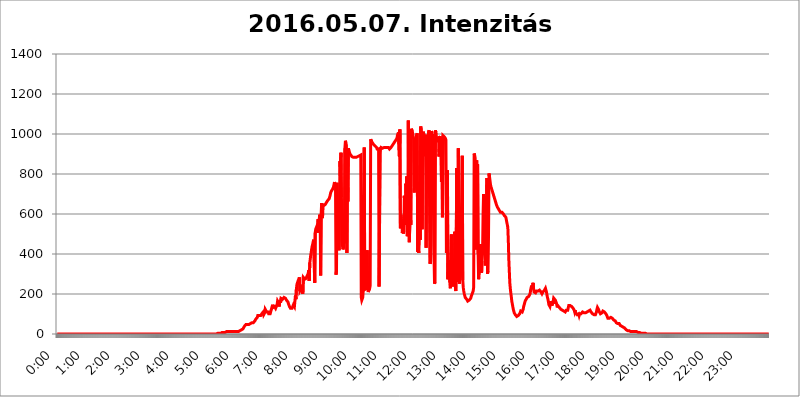
| Category | 2016.05.07. Intenzitás [W/m^2] |
|---|---|
| 0.0 | 0 |
| 0.0006944444444444445 | 0 |
| 0.001388888888888889 | 0 |
| 0.0020833333333333333 | 0 |
| 0.002777777777777778 | 0 |
| 0.003472222222222222 | 0 |
| 0.004166666666666667 | 0 |
| 0.004861111111111111 | 0 |
| 0.005555555555555556 | 0 |
| 0.0062499999999999995 | 0 |
| 0.006944444444444444 | 0 |
| 0.007638888888888889 | 0 |
| 0.008333333333333333 | 0 |
| 0.009027777777777779 | 0 |
| 0.009722222222222222 | 0 |
| 0.010416666666666666 | 0 |
| 0.011111111111111112 | 0 |
| 0.011805555555555555 | 0 |
| 0.012499999999999999 | 0 |
| 0.013194444444444444 | 0 |
| 0.013888888888888888 | 0 |
| 0.014583333333333332 | 0 |
| 0.015277777777777777 | 0 |
| 0.015972222222222224 | 0 |
| 0.016666666666666666 | 0 |
| 0.017361111111111112 | 0 |
| 0.018055555555555557 | 0 |
| 0.01875 | 0 |
| 0.019444444444444445 | 0 |
| 0.02013888888888889 | 0 |
| 0.020833333333333332 | 0 |
| 0.02152777777777778 | 0 |
| 0.022222222222222223 | 0 |
| 0.02291666666666667 | 0 |
| 0.02361111111111111 | 0 |
| 0.024305555555555556 | 0 |
| 0.024999999999999998 | 0 |
| 0.025694444444444447 | 0 |
| 0.02638888888888889 | 0 |
| 0.027083333333333334 | 0 |
| 0.027777777777777776 | 0 |
| 0.02847222222222222 | 0 |
| 0.029166666666666664 | 0 |
| 0.029861111111111113 | 0 |
| 0.030555555555555555 | 0 |
| 0.03125 | 0 |
| 0.03194444444444445 | 0 |
| 0.03263888888888889 | 0 |
| 0.03333333333333333 | 0 |
| 0.034027777777777775 | 0 |
| 0.034722222222222224 | 0 |
| 0.035416666666666666 | 0 |
| 0.036111111111111115 | 0 |
| 0.03680555555555556 | 0 |
| 0.0375 | 0 |
| 0.03819444444444444 | 0 |
| 0.03888888888888889 | 0 |
| 0.03958333333333333 | 0 |
| 0.04027777777777778 | 0 |
| 0.04097222222222222 | 0 |
| 0.041666666666666664 | 0 |
| 0.042361111111111106 | 0 |
| 0.04305555555555556 | 0 |
| 0.043750000000000004 | 0 |
| 0.044444444444444446 | 0 |
| 0.04513888888888889 | 0 |
| 0.04583333333333334 | 0 |
| 0.04652777777777778 | 0 |
| 0.04722222222222222 | 0 |
| 0.04791666666666666 | 0 |
| 0.04861111111111111 | 0 |
| 0.049305555555555554 | 0 |
| 0.049999999999999996 | 0 |
| 0.05069444444444445 | 0 |
| 0.051388888888888894 | 0 |
| 0.052083333333333336 | 0 |
| 0.05277777777777778 | 0 |
| 0.05347222222222222 | 0 |
| 0.05416666666666667 | 0 |
| 0.05486111111111111 | 0 |
| 0.05555555555555555 | 0 |
| 0.05625 | 0 |
| 0.05694444444444444 | 0 |
| 0.057638888888888885 | 0 |
| 0.05833333333333333 | 0 |
| 0.05902777777777778 | 0 |
| 0.059722222222222225 | 0 |
| 0.06041666666666667 | 0 |
| 0.061111111111111116 | 0 |
| 0.06180555555555556 | 0 |
| 0.0625 | 0 |
| 0.06319444444444444 | 0 |
| 0.06388888888888888 | 0 |
| 0.06458333333333334 | 0 |
| 0.06527777777777778 | 0 |
| 0.06597222222222222 | 0 |
| 0.06666666666666667 | 0 |
| 0.06736111111111111 | 0 |
| 0.06805555555555555 | 0 |
| 0.06874999999999999 | 0 |
| 0.06944444444444443 | 0 |
| 0.07013888888888889 | 0 |
| 0.07083333333333333 | 0 |
| 0.07152777777777779 | 0 |
| 0.07222222222222223 | 0 |
| 0.07291666666666667 | 0 |
| 0.07361111111111111 | 0 |
| 0.07430555555555556 | 0 |
| 0.075 | 0 |
| 0.07569444444444444 | 0 |
| 0.0763888888888889 | 0 |
| 0.07708333333333334 | 0 |
| 0.07777777777777778 | 0 |
| 0.07847222222222222 | 0 |
| 0.07916666666666666 | 0 |
| 0.0798611111111111 | 0 |
| 0.08055555555555556 | 0 |
| 0.08125 | 0 |
| 0.08194444444444444 | 0 |
| 0.08263888888888889 | 0 |
| 0.08333333333333333 | 0 |
| 0.08402777777777777 | 0 |
| 0.08472222222222221 | 0 |
| 0.08541666666666665 | 0 |
| 0.08611111111111112 | 0 |
| 0.08680555555555557 | 0 |
| 0.08750000000000001 | 0 |
| 0.08819444444444445 | 0 |
| 0.08888888888888889 | 0 |
| 0.08958333333333333 | 0 |
| 0.09027777777777778 | 0 |
| 0.09097222222222222 | 0 |
| 0.09166666666666667 | 0 |
| 0.09236111111111112 | 0 |
| 0.09305555555555556 | 0 |
| 0.09375 | 0 |
| 0.09444444444444444 | 0 |
| 0.09513888888888888 | 0 |
| 0.09583333333333333 | 0 |
| 0.09652777777777777 | 0 |
| 0.09722222222222222 | 0 |
| 0.09791666666666667 | 0 |
| 0.09861111111111111 | 0 |
| 0.09930555555555555 | 0 |
| 0.09999999999999999 | 0 |
| 0.10069444444444443 | 0 |
| 0.1013888888888889 | 0 |
| 0.10208333333333335 | 0 |
| 0.10277777777777779 | 0 |
| 0.10347222222222223 | 0 |
| 0.10416666666666667 | 0 |
| 0.10486111111111111 | 0 |
| 0.10555555555555556 | 0 |
| 0.10625 | 0 |
| 0.10694444444444444 | 0 |
| 0.1076388888888889 | 0 |
| 0.10833333333333334 | 0 |
| 0.10902777777777778 | 0 |
| 0.10972222222222222 | 0 |
| 0.1111111111111111 | 0 |
| 0.11180555555555556 | 0 |
| 0.11180555555555556 | 0 |
| 0.1125 | 0 |
| 0.11319444444444444 | 0 |
| 0.11388888888888889 | 0 |
| 0.11458333333333333 | 0 |
| 0.11527777777777777 | 0 |
| 0.11597222222222221 | 0 |
| 0.11666666666666665 | 0 |
| 0.1173611111111111 | 0 |
| 0.11805555555555557 | 0 |
| 0.11944444444444445 | 0 |
| 0.12013888888888889 | 0 |
| 0.12083333333333333 | 0 |
| 0.12152777777777778 | 0 |
| 0.12222222222222223 | 0 |
| 0.12291666666666667 | 0 |
| 0.12291666666666667 | 0 |
| 0.12361111111111112 | 0 |
| 0.12430555555555556 | 0 |
| 0.125 | 0 |
| 0.12569444444444444 | 0 |
| 0.12638888888888888 | 0 |
| 0.12708333333333333 | 0 |
| 0.16875 | 0 |
| 0.12847222222222224 | 0 |
| 0.12916666666666668 | 0 |
| 0.12986111111111112 | 0 |
| 0.13055555555555556 | 0 |
| 0.13125 | 0 |
| 0.13194444444444445 | 0 |
| 0.1326388888888889 | 0 |
| 0.13333333333333333 | 0 |
| 0.13402777777777777 | 0 |
| 0.13402777777777777 | 0 |
| 0.13472222222222222 | 0 |
| 0.13541666666666666 | 0 |
| 0.1361111111111111 | 0 |
| 0.13749999999999998 | 0 |
| 0.13819444444444443 | 0 |
| 0.1388888888888889 | 0 |
| 0.13958333333333334 | 0 |
| 0.14027777777777778 | 0 |
| 0.14097222222222222 | 0 |
| 0.14166666666666666 | 0 |
| 0.1423611111111111 | 0 |
| 0.14305555555555557 | 0 |
| 0.14375000000000002 | 0 |
| 0.14444444444444446 | 0 |
| 0.1451388888888889 | 0 |
| 0.1451388888888889 | 0 |
| 0.14652777777777778 | 0 |
| 0.14722222222222223 | 0 |
| 0.14791666666666667 | 0 |
| 0.1486111111111111 | 0 |
| 0.14930555555555555 | 0 |
| 0.15 | 0 |
| 0.15069444444444444 | 0 |
| 0.15138888888888888 | 0 |
| 0.15208333333333332 | 0 |
| 0.15277777777777776 | 0 |
| 0.15347222222222223 | 0 |
| 0.15416666666666667 | 0 |
| 0.15486111111111112 | 0 |
| 0.15555555555555556 | 0 |
| 0.15625 | 0 |
| 0.15694444444444444 | 0 |
| 0.15763888888888888 | 0 |
| 0.15833333333333333 | 0 |
| 0.15902777777777777 | 0 |
| 0.15972222222222224 | 0 |
| 0.16041666666666668 | 0 |
| 0.16111111111111112 | 0 |
| 0.16180555555555556 | 0 |
| 0.1625 | 0 |
| 0.16319444444444445 | 0 |
| 0.1638888888888889 | 0 |
| 0.16458333333333333 | 0 |
| 0.16527777777777777 | 0 |
| 0.16597222222222222 | 0 |
| 0.16666666666666666 | 0 |
| 0.1673611111111111 | 0 |
| 0.16805555555555554 | 0 |
| 0.16874999999999998 | 0 |
| 0.16944444444444443 | 0 |
| 0.17013888888888887 | 0 |
| 0.1708333333333333 | 0 |
| 0.17152777777777775 | 0 |
| 0.17222222222222225 | 0 |
| 0.1729166666666667 | 0 |
| 0.17361111111111113 | 0 |
| 0.17430555555555557 | 0 |
| 0.17500000000000002 | 0 |
| 0.17569444444444446 | 0 |
| 0.1763888888888889 | 0 |
| 0.17708333333333334 | 0 |
| 0.17777777777777778 | 0 |
| 0.17847222222222223 | 0 |
| 0.17916666666666667 | 0 |
| 0.1798611111111111 | 0 |
| 0.18055555555555555 | 0 |
| 0.18125 | 0 |
| 0.18194444444444444 | 0 |
| 0.1826388888888889 | 0 |
| 0.18333333333333335 | 0 |
| 0.1840277777777778 | 0 |
| 0.18472222222222223 | 0 |
| 0.18541666666666667 | 0 |
| 0.18611111111111112 | 0 |
| 0.18680555555555556 | 0 |
| 0.1875 | 0 |
| 0.18819444444444444 | 0 |
| 0.18888888888888888 | 0 |
| 0.18958333333333333 | 0 |
| 0.19027777777777777 | 0 |
| 0.1909722222222222 | 0 |
| 0.19166666666666665 | 0 |
| 0.19236111111111112 | 0 |
| 0.19305555555555554 | 0 |
| 0.19375 | 0 |
| 0.19444444444444445 | 0 |
| 0.1951388888888889 | 0 |
| 0.19583333333333333 | 0 |
| 0.19652777777777777 | 0 |
| 0.19722222222222222 | 0 |
| 0.19791666666666666 | 0 |
| 0.1986111111111111 | 0 |
| 0.19930555555555554 | 0 |
| 0.19999999999999998 | 0 |
| 0.20069444444444443 | 0 |
| 0.20138888888888887 | 0 |
| 0.2020833333333333 | 0 |
| 0.2027777777777778 | 0 |
| 0.2034722222222222 | 0 |
| 0.2041666666666667 | 0 |
| 0.20486111111111113 | 0 |
| 0.20555555555555557 | 0 |
| 0.20625000000000002 | 0 |
| 0.20694444444444446 | 0 |
| 0.2076388888888889 | 0 |
| 0.20833333333333334 | 0 |
| 0.20902777777777778 | 0 |
| 0.20972222222222223 | 0 |
| 0.21041666666666667 | 0 |
| 0.2111111111111111 | 0 |
| 0.21180555555555555 | 0 |
| 0.2125 | 0 |
| 0.21319444444444444 | 0 |
| 0.2138888888888889 | 0 |
| 0.21458333333333335 | 0 |
| 0.2152777777777778 | 0 |
| 0.21597222222222223 | 0 |
| 0.21666666666666667 | 0 |
| 0.21736111111111112 | 0 |
| 0.21805555555555556 | 0 |
| 0.21875 | 0 |
| 0.21944444444444444 | 0 |
| 0.22013888888888888 | 0 |
| 0.22083333333333333 | 0 |
| 0.22152777777777777 | 0 |
| 0.2222222222222222 | 0 |
| 0.22291666666666665 | 0 |
| 0.2236111111111111 | 0 |
| 0.22430555555555556 | 3.525 |
| 0.225 | 3.525 |
| 0.22569444444444445 | 3.525 |
| 0.2263888888888889 | 3.525 |
| 0.22708333333333333 | 3.525 |
| 0.22777777777777777 | 3.525 |
| 0.22847222222222222 | 3.525 |
| 0.22916666666666666 | 3.525 |
| 0.2298611111111111 | 3.525 |
| 0.23055555555555554 | 3.525 |
| 0.23124999999999998 | 7.887 |
| 0.23194444444444443 | 7.887 |
| 0.23263888888888887 | 7.887 |
| 0.2333333333333333 | 7.887 |
| 0.2340277777777778 | 7.887 |
| 0.2347222222222222 | 7.887 |
| 0.2354166666666667 | 7.887 |
| 0.23611111111111113 | 7.887 |
| 0.23680555555555557 | 7.887 |
| 0.23750000000000002 | 12.257 |
| 0.23819444444444446 | 12.257 |
| 0.2388888888888889 | 12.257 |
| 0.23958333333333334 | 12.257 |
| 0.24027777777777778 | 12.257 |
| 0.24097222222222223 | 12.257 |
| 0.24166666666666667 | 12.257 |
| 0.2423611111111111 | 12.257 |
| 0.24305555555555555 | 12.257 |
| 0.24375 | 12.257 |
| 0.24444444444444446 | 12.257 |
| 0.24513888888888888 | 12.257 |
| 0.24583333333333335 | 12.257 |
| 0.2465277777777778 | 12.257 |
| 0.24722222222222223 | 12.257 |
| 0.24791666666666667 | 12.257 |
| 0.24861111111111112 | 12.257 |
| 0.24930555555555556 | 12.257 |
| 0.25 | 12.257 |
| 0.25069444444444444 | 12.257 |
| 0.2513888888888889 | 12.257 |
| 0.2520833333333333 | 12.257 |
| 0.25277777777777777 | 12.257 |
| 0.2534722222222222 | 12.257 |
| 0.25416666666666665 | 12.257 |
| 0.2548611111111111 | 12.257 |
| 0.2555555555555556 | 12.257 |
| 0.25625000000000003 | 16.636 |
| 0.2569444444444445 | 16.636 |
| 0.2576388888888889 | 16.636 |
| 0.25833333333333336 | 21.024 |
| 0.2590277777777778 | 21.024 |
| 0.25972222222222224 | 21.024 |
| 0.2604166666666667 | 25.419 |
| 0.2611111111111111 | 25.419 |
| 0.26180555555555557 | 29.823 |
| 0.2625 | 38.653 |
| 0.26319444444444445 | 43.079 |
| 0.2638888888888889 | 43.079 |
| 0.26458333333333334 | 47.511 |
| 0.2652777777777778 | 43.079 |
| 0.2659722222222222 | 43.079 |
| 0.26666666666666666 | 47.511 |
| 0.2673611111111111 | 47.511 |
| 0.26805555555555555 | 47.511 |
| 0.26875 | 47.511 |
| 0.26944444444444443 | 47.511 |
| 0.2701388888888889 | 47.511 |
| 0.2708333333333333 | 51.951 |
| 0.27152777777777776 | 51.951 |
| 0.2722222222222222 | 56.398 |
| 0.27291666666666664 | 56.398 |
| 0.2736111111111111 | 56.398 |
| 0.2743055555555555 | 56.398 |
| 0.27499999999999997 | 56.398 |
| 0.27569444444444446 | 56.398 |
| 0.27638888888888885 | 56.398 |
| 0.27708333333333335 | 65.31 |
| 0.2777777777777778 | 69.775 |
| 0.27847222222222223 | 74.246 |
| 0.2791666666666667 | 78.722 |
| 0.2798611111111111 | 78.722 |
| 0.28055555555555556 | 83.205 |
| 0.28125 | 92.184 |
| 0.28194444444444444 | 92.184 |
| 0.2826388888888889 | 92.184 |
| 0.2833333333333333 | 92.184 |
| 0.28402777777777777 | 92.184 |
| 0.2847222222222222 | 92.184 |
| 0.28541666666666665 | 92.184 |
| 0.28611111111111115 | 96.682 |
| 0.28680555555555554 | 101.184 |
| 0.28750000000000003 | 101.184 |
| 0.2881944444444445 | 101.184 |
| 0.2888888888888889 | 110.201 |
| 0.28958333333333336 | 96.682 |
| 0.2902777777777778 | 101.184 |
| 0.29097222222222224 | 105.69 |
| 0.2916666666666667 | 123.758 |
| 0.2923611111111111 | 123.758 |
| 0.29305555555555557 | 119.235 |
| 0.29375 | 110.201 |
| 0.29444444444444445 | 105.69 |
| 0.2951388888888889 | 110.201 |
| 0.29583333333333334 | 110.201 |
| 0.2965277777777778 | 101.184 |
| 0.2972222222222222 | 101.184 |
| 0.29791666666666666 | 101.184 |
| 0.2986111111111111 | 101.184 |
| 0.29930555555555555 | 110.201 |
| 0.3 | 119.235 |
| 0.30069444444444443 | 128.284 |
| 0.3013888888888889 | 128.284 |
| 0.3020833333333333 | 146.423 |
| 0.30277777777777776 | 132.814 |
| 0.3034722222222222 | 137.347 |
| 0.30416666666666664 | 137.347 |
| 0.3048611111111111 | 137.347 |
| 0.3055555555555555 | 132.814 |
| 0.30624999999999997 | 128.284 |
| 0.3069444444444444 | 128.284 |
| 0.3076388888888889 | 128.284 |
| 0.30833333333333335 | 146.423 |
| 0.3090277777777778 | 164.605 |
| 0.30972222222222223 | 160.056 |
| 0.3104166666666667 | 155.509 |
| 0.3111111111111111 | 137.347 |
| 0.31180555555555556 | 141.884 |
| 0.3125 | 169.156 |
| 0.31319444444444444 | 155.509 |
| 0.3138888888888889 | 178.264 |
| 0.3145833333333333 | 173.709 |
| 0.31527777777777777 | 182.82 |
| 0.3159722222222222 | 173.709 |
| 0.31666666666666665 | 178.264 |
| 0.31736111111111115 | 178.264 |
| 0.31805555555555554 | 182.82 |
| 0.31875000000000003 | 182.82 |
| 0.3194444444444445 | 182.82 |
| 0.3201388888888889 | 178.264 |
| 0.32083333333333336 | 173.709 |
| 0.3215277777777778 | 169.156 |
| 0.32222222222222224 | 169.156 |
| 0.3229166666666667 | 164.605 |
| 0.3236111111111111 | 160.056 |
| 0.32430555555555557 | 150.964 |
| 0.325 | 146.423 |
| 0.32569444444444445 | 137.347 |
| 0.3263888888888889 | 132.814 |
| 0.32708333333333334 | 128.284 |
| 0.3277777777777778 | 128.284 |
| 0.3284722222222222 | 128.284 |
| 0.32916666666666666 | 128.284 |
| 0.3298611111111111 | 128.284 |
| 0.33055555555555555 | 128.284 |
| 0.33125 | 146.423 |
| 0.33194444444444443 | 146.423 |
| 0.3326388888888889 | 137.347 |
| 0.3333333333333333 | 137.347 |
| 0.3340277777777778 | 191.937 |
| 0.3347222222222222 | 173.709 |
| 0.3354166666666667 | 223.873 |
| 0.3361111111111111 | 246.689 |
| 0.3368055555555556 | 255.813 |
| 0.33749999999999997 | 260.373 |
| 0.33819444444444446 | 269.49 |
| 0.33888888888888885 | 274.047 |
| 0.33958333333333335 | 283.156 |
| 0.34027777777777773 | 214.746 |
| 0.34097222222222223 | 214.746 |
| 0.3416666666666666 | 223.873 |
| 0.3423611111111111 | 242.127 |
| 0.3430555555555555 | 219.309 |
| 0.34375 | 210.182 |
| 0.3444444444444445 | 201.058 |
| 0.3451388888888889 | 283.156 |
| 0.3458333333333334 | 283.156 |
| 0.34652777777777777 | 278.603 |
| 0.34722222222222227 | 274.047 |
| 0.34791666666666665 | 274.047 |
| 0.34861111111111115 | 278.603 |
| 0.34930555555555554 | 278.603 |
| 0.35000000000000003 | 287.709 |
| 0.3506944444444444 | 283.156 |
| 0.3513888888888889 | 296.808 |
| 0.3520833333333333 | 305.898 |
| 0.3527777777777778 | 319.517 |
| 0.3534722222222222 | 264.932 |
| 0.3541666666666667 | 355.712 |
| 0.3548611111111111 | 373.729 |
| 0.35555555555555557 | 396.164 |
| 0.35625 | 409.574 |
| 0.35694444444444445 | 427.39 |
| 0.3576388888888889 | 440.702 |
| 0.35833333333333334 | 449.551 |
| 0.3590277777777778 | 462.786 |
| 0.3597222222222222 | 471.582 |
| 0.36041666666666666 | 475.972 |
| 0.3611111111111111 | 255.813 |
| 0.36180555555555555 | 506.542 |
| 0.3625 | 523.88 |
| 0.36319444444444443 | 519.555 |
| 0.3638888888888889 | 536.82 |
| 0.3645833333333333 | 532.513 |
| 0.3652777777777778 | 506.542 |
| 0.3659722222222222 | 575.299 |
| 0.3666666666666667 | 541.121 |
| 0.3673611111111111 | 571.049 |
| 0.3680555555555556 | 596.45 |
| 0.36874999999999997 | 571.049 |
| 0.36944444444444446 | 292.259 |
| 0.37013888888888885 | 600.661 |
| 0.37083333333333335 | 654.791 |
| 0.37152777777777773 | 579.542 |
| 0.37222222222222223 | 592.233 |
| 0.3729166666666666 | 650.667 |
| 0.3736111111111111 | 642.4 |
| 0.3743055555555555 | 646.537 |
| 0.375 | 646.537 |
| 0.3756944444444445 | 646.537 |
| 0.3763888888888889 | 642.4 |
| 0.3770833333333334 | 654.791 |
| 0.37777777777777777 | 650.667 |
| 0.37847222222222227 | 658.909 |
| 0.37916666666666665 | 667.123 |
| 0.37986111111111115 | 667.123 |
| 0.38055555555555554 | 667.123 |
| 0.38125000000000003 | 675.311 |
| 0.3819444444444444 | 683.473 |
| 0.3826388888888889 | 691.608 |
| 0.3833333333333333 | 703.762 |
| 0.3840277777777778 | 711.832 |
| 0.3847222222222222 | 711.832 |
| 0.3854166666666667 | 715.858 |
| 0.3861111111111111 | 723.889 |
| 0.38680555555555557 | 719.877 |
| 0.3875 | 735.89 |
| 0.38819444444444445 | 747.834 |
| 0.3888888888888889 | 759.723 |
| 0.38958333333333334 | 759.723 |
| 0.3902777777777778 | 735.89 |
| 0.3909722222222222 | 296.808 |
| 0.39166666666666666 | 314.98 |
| 0.3923611111111111 | 755.766 |
| 0.39305555555555555 | 558.261 |
| 0.39375 | 588.009 |
| 0.39444444444444443 | 629.948 |
| 0.3951388888888889 | 418.492 |
| 0.3958333333333333 | 621.613 |
| 0.3965277777777778 | 864.493 |
| 0.3972222222222222 | 775.492 |
| 0.3979166666666667 | 906.223 |
| 0.3986111111111111 | 683.473 |
| 0.3993055555555556 | 467.187 |
| 0.39999999999999997 | 440.702 |
| 0.40069444444444446 | 422.943 |
| 0.40138888888888885 | 431.833 |
| 0.40208333333333335 | 604.864 |
| 0.40277777777777773 | 453.968 |
| 0.40347222222222223 | 928.819 |
| 0.4041666666666666 | 966.295 |
| 0.4048611111111111 | 955.071 |
| 0.4055555555555555 | 943.832 |
| 0.40625 | 405.108 |
| 0.4069444444444445 | 795.074 |
| 0.4076388888888889 | 663.019 |
| 0.4083333333333334 | 928.819 |
| 0.40902777777777777 | 917.534 |
| 0.40972222222222227 | 909.996 |
| 0.41041666666666665 | 902.447 |
| 0.41111111111111115 | 898.668 |
| 0.41180555555555554 | 894.885 |
| 0.41250000000000003 | 891.099 |
| 0.4131944444444444 | 887.309 |
| 0.4138888888888889 | 887.309 |
| 0.4145833333333333 | 883.516 |
| 0.4152777777777778 | 883.516 |
| 0.4159722222222222 | 883.516 |
| 0.4166666666666667 | 887.309 |
| 0.4173611111111111 | 883.516 |
| 0.41805555555555557 | 879.719 |
| 0.41875 | 879.719 |
| 0.41944444444444445 | 883.516 |
| 0.4201388888888889 | 883.516 |
| 0.42083333333333334 | 883.516 |
| 0.4215277777777778 | 887.309 |
| 0.4222222222222222 | 887.309 |
| 0.42291666666666666 | 887.309 |
| 0.4236111111111111 | 891.099 |
| 0.42430555555555555 | 891.099 |
| 0.425 | 894.885 |
| 0.42569444444444443 | 894.885 |
| 0.4263888888888889 | 182.82 |
| 0.4270833333333333 | 169.156 |
| 0.4277777777777778 | 173.709 |
| 0.4284722222222222 | 182.82 |
| 0.4291666666666667 | 219.309 |
| 0.4298611111111111 | 545.416 |
| 0.4305555555555556 | 932.576 |
| 0.43124999999999997 | 246.689 |
| 0.43194444444444446 | 223.873 |
| 0.43263888888888885 | 223.873 |
| 0.43333333333333335 | 219.309 |
| 0.43402777777777773 | 228.436 |
| 0.43472222222222223 | 418.492 |
| 0.4354166666666666 | 233 |
| 0.4361111111111111 | 210.182 |
| 0.4368055555555555 | 205.62 |
| 0.4375 | 214.746 |
| 0.4381944444444445 | 228.436 |
| 0.4388888888888889 | 242.127 |
| 0.4395833333333334 | 973.772 |
| 0.44027777777777777 | 970.034 |
| 0.44097222222222227 | 962.555 |
| 0.44166666666666665 | 958.814 |
| 0.44236111111111115 | 955.071 |
| 0.44305555555555554 | 955.071 |
| 0.44375000000000003 | 947.58 |
| 0.4444444444444444 | 947.58 |
| 0.4451388888888889 | 943.832 |
| 0.4458333333333333 | 940.082 |
| 0.4465277777777778 | 940.082 |
| 0.4472222222222222 | 936.33 |
| 0.4479166666666667 | 932.576 |
| 0.4486111111111111 | 925.06 |
| 0.44930555555555557 | 925.06 |
| 0.45 | 925.06 |
| 0.45069444444444445 | 925.06 |
| 0.4513888888888889 | 237.564 |
| 0.45208333333333334 | 233 |
| 0.4527777777777778 | 932.576 |
| 0.4534722222222222 | 925.06 |
| 0.45416666666666666 | 932.576 |
| 0.4548611111111111 | 932.576 |
| 0.45555555555555555 | 932.576 |
| 0.45625 | 928.819 |
| 0.45694444444444443 | 925.06 |
| 0.4576388888888889 | 928.819 |
| 0.4583333333333333 | 932.576 |
| 0.4590277777777778 | 936.33 |
| 0.4597222222222222 | 932.576 |
| 0.4604166666666667 | 932.576 |
| 0.4611111111111111 | 932.576 |
| 0.4618055555555556 | 936.33 |
| 0.46249999999999997 | 932.576 |
| 0.46319444444444446 | 932.576 |
| 0.46388888888888885 | 928.819 |
| 0.46458333333333335 | 932.576 |
| 0.46527777777777773 | 928.819 |
| 0.46597222222222223 | 925.06 |
| 0.4666666666666666 | 928.819 |
| 0.4673611111111111 | 928.819 |
| 0.4680555555555555 | 932.576 |
| 0.46875 | 932.576 |
| 0.4694444444444445 | 940.082 |
| 0.4701388888888889 | 940.082 |
| 0.4708333333333334 | 947.58 |
| 0.47152777777777777 | 947.58 |
| 0.47222222222222227 | 955.071 |
| 0.47291666666666665 | 955.071 |
| 0.47361111111111115 | 958.814 |
| 0.47430555555555554 | 966.295 |
| 0.47500000000000003 | 966.295 |
| 0.4756944444444444 | 970.034 |
| 0.4763888888888889 | 977.508 |
| 0.4770833333333333 | 992.448 |
| 0.4777777777777778 | 996.182 |
| 0.4784722222222222 | 1007.383 |
| 0.4791666666666667 | 1007.383 |
| 0.4798611111111111 | 887.309 |
| 0.48055555555555557 | 1022.323 |
| 0.48125 | 528.2 |
| 0.48194444444444445 | 596.45 |
| 0.4826388888888889 | 575.299 |
| 0.48333333333333334 | 553.986 |
| 0.4840277777777778 | 506.542 |
| 0.4847222222222222 | 575.299 |
| 0.48541666666666666 | 502.192 |
| 0.4861111111111111 | 515.223 |
| 0.48680555555555555 | 691.608 |
| 0.4875 | 545.416 |
| 0.48819444444444443 | 592.233 |
| 0.4888888888888889 | 751.803 |
| 0.4895833333333333 | 675.311 |
| 0.4902777777777778 | 787.258 |
| 0.4909722222222222 | 489.108 |
| 0.4916666666666667 | 510.885 |
| 0.4923611111111111 | 1067.267 |
| 0.4930555555555556 | 536.82 |
| 0.49374999999999997 | 458.38 |
| 0.49444444444444446 | 462.786 |
| 0.49513888888888885 | 625.784 |
| 0.49583333333333335 | 545.416 |
| 0.49652777777777773 | 1026.06 |
| 0.49722222222222223 | 1029.798 |
| 0.4979166666666666 | 1014.852 |
| 0.4986111111111111 | 999.916 |
| 0.4993055555555555 | 981.244 |
| 0.5 | 973.772 |
| 0.5006944444444444 | 707.8 |
| 0.5013888888888889 | 783.342 |
| 0.5020833333333333 | 973.772 |
| 0.5027777777777778 | 981.244 |
| 0.5034722222222222 | 981.244 |
| 0.5041666666666667 | 984.98 |
| 0.5048611111111111 | 1003.65 |
| 0.5055555555555555 | 409.574 |
| 0.50625 | 467.187 |
| 0.5069444444444444 | 405.108 |
| 0.5076388888888889 | 510.885 |
| 0.5083333333333333 | 650.667 |
| 0.5090277777777777 | 471.582 |
| 0.5097222222222222 | 1037.277 |
| 0.5104166666666666 | 1018.587 |
| 0.5111111111111112 | 1011.118 |
| 0.5118055555555555 | 523.88 |
| 0.5125000000000001 | 883.516 |
| 0.5131944444444444 | 1011.118 |
| 0.513888888888889 | 1003.65 |
| 0.5145833333333333 | 996.182 |
| 0.5152777777777778 | 988.714 |
| 0.5159722222222222 | 996.182 |
| 0.5166666666666667 | 887.309 |
| 0.517361111111111 | 431.833 |
| 0.5180555555555556 | 909.996 |
| 0.5187499999999999 | 996.182 |
| 0.5194444444444445 | 999.916 |
| 0.5201388888888888 | 719.877 |
| 0.5208333333333334 | 1011.118 |
| 0.5215277777777778 | 1018.587 |
| 0.5222222222222223 | 1014.852 |
| 0.5229166666666667 | 351.198 |
| 0.5236111111111111 | 360.221 |
| 0.5243055555555556 | 445.129 |
| 0.525 | 1014.852 |
| 0.5256944444444445 | 1003.65 |
| 0.5263888888888889 | 977.508 |
| 0.5270833333333333 | 999.916 |
| 0.5277777777777778 | 596.45 |
| 0.5284722222222222 | 382.715 |
| 0.5291666666666667 | 251.251 |
| 0.5298611111111111 | 260.373 |
| 0.5305555555555556 | 1018.587 |
| 0.53125 | 996.182 |
| 0.5319444444444444 | 984.98 |
| 0.5326388888888889 | 977.508 |
| 0.5333333333333333 | 973.772 |
| 0.5340277777777778 | 977.508 |
| 0.5347222222222222 | 981.244 |
| 0.5354166666666667 | 887.309 |
| 0.5361111111111111 | 936.33 |
| 0.5368055555555555 | 988.714 |
| 0.5375 | 936.33 |
| 0.5381944444444444 | 984.98 |
| 0.5388888888888889 | 759.723 |
| 0.5395833333333333 | 977.508 |
| 0.5402777777777777 | 583.779 |
| 0.5409722222222222 | 992.448 |
| 0.5416666666666666 | 992.448 |
| 0.5423611111111112 | 992.448 |
| 0.5430555555555555 | 984.98 |
| 0.5437500000000001 | 981.244 |
| 0.5444444444444444 | 977.508 |
| 0.545138888888889 | 970.034 |
| 0.5458333333333333 | 405.108 |
| 0.5465277777777778 | 480.356 |
| 0.5472222222222222 | 818.392 |
| 0.5479166666666667 | 274.047 |
| 0.548611111111111 | 360.221 |
| 0.5493055555555556 | 278.603 |
| 0.5499999999999999 | 369.23 |
| 0.5506944444444445 | 255.813 |
| 0.5513888888888888 | 228.436 |
| 0.5520833333333334 | 228.436 |
| 0.5527777777777778 | 497.836 |
| 0.5534722222222223 | 269.49 |
| 0.5541666666666667 | 251.251 |
| 0.5548611111111111 | 237.564 |
| 0.5555555555555556 | 242.127 |
| 0.55625 | 382.715 |
| 0.5569444444444445 | 287.709 |
| 0.5576388888888889 | 510.885 |
| 0.5583333333333333 | 237.564 |
| 0.5590277777777778 | 214.746 |
| 0.5597222222222222 | 219.309 |
| 0.5604166666666667 | 829.981 |
| 0.5611111111111111 | 260.373 |
| 0.5618055555555556 | 274.047 |
| 0.5625 | 928.819 |
| 0.5631944444444444 | 283.156 |
| 0.5638888888888889 | 251.251 |
| 0.5645833333333333 | 274.047 |
| 0.5652777777777778 | 283.156 |
| 0.5659722222222222 | 305.898 |
| 0.5666666666666667 | 532.513 |
| 0.5673611111111111 | 751.803 |
| 0.5680555555555555 | 891.099 |
| 0.56875 | 269.49 |
| 0.5694444444444444 | 233 |
| 0.5701388888888889 | 214.746 |
| 0.5708333333333333 | 201.058 |
| 0.5715277777777777 | 191.937 |
| 0.5722222222222222 | 182.82 |
| 0.5729166666666666 | 182.82 |
| 0.5736111111111112 | 178.264 |
| 0.5743055555555555 | 173.709 |
| 0.5750000000000001 | 169.156 |
| 0.5756944444444444 | 164.605 |
| 0.576388888888889 | 164.605 |
| 0.5770833333333333 | 164.605 |
| 0.5777777777777778 | 169.156 |
| 0.5784722222222222 | 169.156 |
| 0.5791666666666667 | 173.709 |
| 0.579861111111111 | 178.264 |
| 0.5805555555555556 | 187.378 |
| 0.5812499999999999 | 191.937 |
| 0.5819444444444445 | 201.058 |
| 0.5826388888888888 | 205.62 |
| 0.5833333333333334 | 214.746 |
| 0.5840277777777778 | 233 |
| 0.5847222222222223 | 902.447 |
| 0.5854166666666667 | 894.885 |
| 0.5861111111111111 | 879.719 |
| 0.5868055555555556 | 422.943 |
| 0.5875 | 860.676 |
| 0.5881944444444445 | 868.305 |
| 0.5888888888888889 | 822.26 |
| 0.5895833333333333 | 849.199 |
| 0.5902777777777778 | 400.638 |
| 0.5909722222222222 | 274.047 |
| 0.5916666666666667 | 314.98 |
| 0.5923611111111111 | 414.035 |
| 0.5930555555555556 | 328.584 |
| 0.59375 | 449.551 |
| 0.5944444444444444 | 346.682 |
| 0.5951388888888889 | 305.898 |
| 0.5958333333333333 | 364.728 |
| 0.5965277777777778 | 405.108 |
| 0.5972222222222222 | 596.45 |
| 0.5979166666666667 | 699.717 |
| 0.5986111111111111 | 634.105 |
| 0.5993055555555555 | 510.885 |
| 0.6 | 431.833 |
| 0.6006944444444444 | 342.162 |
| 0.6013888888888889 | 675.311 |
| 0.6020833333333333 | 667.123 |
| 0.6027777777777777 | 779.42 |
| 0.6034722222222222 | 301.354 |
| 0.6041666666666666 | 314.98 |
| 0.6048611111111112 | 489.108 |
| 0.6055555555555555 | 802.868 |
| 0.6062500000000001 | 787.258 |
| 0.6069444444444444 | 767.62 |
| 0.607638888888889 | 747.834 |
| 0.6083333333333333 | 735.89 |
| 0.6090277777777778 | 727.896 |
| 0.6097222222222222 | 723.889 |
| 0.6104166666666667 | 711.832 |
| 0.611111111111111 | 703.762 |
| 0.6118055555555556 | 695.666 |
| 0.6124999999999999 | 687.544 |
| 0.6131944444444445 | 683.473 |
| 0.6138888888888888 | 671.22 |
| 0.6145833333333334 | 663.019 |
| 0.6152777777777778 | 654.791 |
| 0.6159722222222223 | 646.537 |
| 0.6166666666666667 | 642.4 |
| 0.6173611111111111 | 634.105 |
| 0.6180555555555556 | 629.948 |
| 0.61875 | 625.784 |
| 0.6194444444444445 | 621.613 |
| 0.6201388888888889 | 617.436 |
| 0.6208333333333333 | 613.252 |
| 0.6215277777777778 | 609.062 |
| 0.6222222222222222 | 609.062 |
| 0.6229166666666667 | 609.062 |
| 0.6236111111111111 | 609.062 |
| 0.6243055555555556 | 609.062 |
| 0.625 | 604.864 |
| 0.6256944444444444 | 600.661 |
| 0.6263888888888889 | 600.661 |
| 0.6270833333333333 | 592.233 |
| 0.6277777777777778 | 592.233 |
| 0.6284722222222222 | 588.009 |
| 0.6291666666666667 | 583.779 |
| 0.6298611111111111 | 571.049 |
| 0.6305555555555555 | 566.793 |
| 0.63125 | 566.793 |
| 0.6319444444444444 | 532.513 |
| 0.6326388888888889 | 467.187 |
| 0.6333333333333333 | 373.729 |
| 0.6340277777777777 | 314.98 |
| 0.6347222222222222 | 255.813 |
| 0.6354166666666666 | 228.436 |
| 0.6361111111111112 | 205.62 |
| 0.6368055555555555 | 187.378 |
| 0.6375000000000001 | 164.605 |
| 0.6381944444444444 | 150.964 |
| 0.638888888888889 | 137.347 |
| 0.6395833333333333 | 123.758 |
| 0.6402777777777778 | 114.716 |
| 0.6409722222222222 | 105.69 |
| 0.6416666666666667 | 101.184 |
| 0.642361111111111 | 96.682 |
| 0.6430555555555556 | 92.184 |
| 0.6437499999999999 | 92.184 |
| 0.6444444444444445 | 87.692 |
| 0.6451388888888888 | 87.692 |
| 0.6458333333333334 | 87.692 |
| 0.6465277777777778 | 92.184 |
| 0.6472222222222223 | 92.184 |
| 0.6479166666666667 | 96.682 |
| 0.6486111111111111 | 101.184 |
| 0.6493055555555556 | 105.69 |
| 0.65 | 114.716 |
| 0.6506944444444445 | 114.716 |
| 0.6513888888888889 | 114.716 |
| 0.6520833333333333 | 110.201 |
| 0.6527777777777778 | 114.716 |
| 0.6534722222222222 | 123.758 |
| 0.6541666666666667 | 137.347 |
| 0.6548611111111111 | 146.423 |
| 0.6555555555555556 | 155.509 |
| 0.65625 | 164.605 |
| 0.6569444444444444 | 169.156 |
| 0.6576388888888889 | 173.709 |
| 0.6583333333333333 | 178.264 |
| 0.6590277777777778 | 182.82 |
| 0.6597222222222222 | 182.82 |
| 0.6604166666666667 | 182.82 |
| 0.6611111111111111 | 187.378 |
| 0.6618055555555555 | 187.378 |
| 0.6625 | 191.937 |
| 0.6631944444444444 | 201.058 |
| 0.6638888888888889 | 219.309 |
| 0.6645833333333333 | 219.309 |
| 0.6652777777777777 | 242.127 |
| 0.6659722222222222 | 233 |
| 0.6666666666666666 | 223.873 |
| 0.6673611111111111 | 255.813 |
| 0.6680555555555556 | 228.436 |
| 0.6687500000000001 | 210.182 |
| 0.6694444444444444 | 205.62 |
| 0.6701388888888888 | 205.62 |
| 0.6708333333333334 | 205.62 |
| 0.6715277777777778 | 210.182 |
| 0.6722222222222222 | 214.746 |
| 0.6729166666666666 | 214.746 |
| 0.6736111111111112 | 214.746 |
| 0.6743055555555556 | 214.746 |
| 0.6749999999999999 | 219.309 |
| 0.6756944444444444 | 219.309 |
| 0.6763888888888889 | 219.309 |
| 0.6770833333333334 | 214.746 |
| 0.6777777777777777 | 214.746 |
| 0.6784722222222223 | 210.182 |
| 0.6791666666666667 | 205.62 |
| 0.6798611111111111 | 201.058 |
| 0.6805555555555555 | 205.62 |
| 0.68125 | 210.182 |
| 0.6819444444444445 | 210.182 |
| 0.6826388888888889 | 214.746 |
| 0.6833333333333332 | 219.309 |
| 0.6840277777777778 | 219.309 |
| 0.6847222222222222 | 228.436 |
| 0.6854166666666667 | 219.309 |
| 0.686111111111111 | 210.182 |
| 0.6868055555555556 | 196.497 |
| 0.6875 | 182.82 |
| 0.6881944444444444 | 173.709 |
| 0.688888888888889 | 160.056 |
| 0.6895833333333333 | 146.423 |
| 0.6902777777777778 | 141.884 |
| 0.6909722222222222 | 137.347 |
| 0.6916666666666668 | 137.347 |
| 0.6923611111111111 | 164.605 |
| 0.6930555555555555 | 164.605 |
| 0.69375 | 141.884 |
| 0.6944444444444445 | 137.347 |
| 0.6951388888888889 | 160.056 |
| 0.6958333333333333 | 150.964 |
| 0.6965277777777777 | 178.264 |
| 0.6972222222222223 | 178.264 |
| 0.6979166666666666 | 173.709 |
| 0.6986111111111111 | 169.156 |
| 0.6993055555555556 | 164.605 |
| 0.7000000000000001 | 155.509 |
| 0.7006944444444444 | 150.964 |
| 0.7013888888888888 | 132.814 |
| 0.7020833333333334 | 141.884 |
| 0.7027777777777778 | 137.347 |
| 0.7034722222222222 | 137.347 |
| 0.7041666666666666 | 132.814 |
| 0.7048611111111112 | 132.814 |
| 0.7055555555555556 | 128.284 |
| 0.7062499999999999 | 123.758 |
| 0.7069444444444444 | 119.235 |
| 0.7076388888888889 | 119.235 |
| 0.7083333333333334 | 119.235 |
| 0.7090277777777777 | 119.235 |
| 0.7097222222222223 | 114.716 |
| 0.7104166666666667 | 114.716 |
| 0.7111111111111111 | 110.201 |
| 0.7118055555555555 | 110.201 |
| 0.7125 | 110.201 |
| 0.7131944444444445 | 114.716 |
| 0.7138888888888889 | 119.235 |
| 0.7145833333333332 | 123.758 |
| 0.7152777777777778 | 123.758 |
| 0.7159722222222222 | 119.235 |
| 0.7166666666666667 | 123.758 |
| 0.717361111111111 | 141.884 |
| 0.7180555555555556 | 137.347 |
| 0.71875 | 141.884 |
| 0.7194444444444444 | 141.884 |
| 0.720138888888889 | 141.884 |
| 0.7208333333333333 | 137.347 |
| 0.7215277777777778 | 137.347 |
| 0.7222222222222222 | 137.347 |
| 0.7229166666666668 | 132.814 |
| 0.7236111111111111 | 128.284 |
| 0.7243055555555555 | 128.284 |
| 0.725 | 119.235 |
| 0.7256944444444445 | 110.201 |
| 0.7263888888888889 | 119.235 |
| 0.7270833333333333 | 105.69 |
| 0.7277777777777777 | 101.184 |
| 0.7284722222222223 | 101.184 |
| 0.7291666666666666 | 96.682 |
| 0.7298611111111111 | 101.184 |
| 0.7305555555555556 | 92.184 |
| 0.7312500000000001 | 101.184 |
| 0.7319444444444444 | 92.184 |
| 0.7326388888888888 | 101.184 |
| 0.7333333333333334 | 101.184 |
| 0.7340277777777778 | 101.184 |
| 0.7347222222222222 | 101.184 |
| 0.7354166666666666 | 105.69 |
| 0.7361111111111112 | 105.69 |
| 0.7368055555555556 | 110.201 |
| 0.7374999999999999 | 110.201 |
| 0.7381944444444444 | 110.201 |
| 0.7388888888888889 | 105.69 |
| 0.7395833333333334 | 110.201 |
| 0.7402777777777777 | 105.69 |
| 0.7409722222222223 | 105.69 |
| 0.7416666666666667 | 105.69 |
| 0.7423611111111111 | 110.201 |
| 0.7430555555555555 | 110.201 |
| 0.74375 | 110.201 |
| 0.7444444444444445 | 110.201 |
| 0.7451388888888889 | 114.716 |
| 0.7458333333333332 | 114.716 |
| 0.7465277777777778 | 119.235 |
| 0.7472222222222222 | 119.235 |
| 0.7479166666666667 | 114.716 |
| 0.748611111111111 | 110.201 |
| 0.7493055555555556 | 110.201 |
| 0.75 | 105.69 |
| 0.7506944444444444 | 101.184 |
| 0.751388888888889 | 101.184 |
| 0.7520833333333333 | 96.682 |
| 0.7527777777777778 | 96.682 |
| 0.7534722222222222 | 96.682 |
| 0.7541666666666668 | 96.682 |
| 0.7548611111111111 | 96.682 |
| 0.7555555555555555 | 101.184 |
| 0.75625 | 110.201 |
| 0.7569444444444445 | 123.758 |
| 0.7576388888888889 | 132.814 |
| 0.7583333333333333 | 128.284 |
| 0.7590277777777777 | 123.758 |
| 0.7597222222222223 | 119.235 |
| 0.7604166666666666 | 110.201 |
| 0.7611111111111111 | 105.69 |
| 0.7618055555555556 | 101.184 |
| 0.7625000000000001 | 96.682 |
| 0.7631944444444444 | 101.184 |
| 0.7638888888888888 | 105.69 |
| 0.7645833333333334 | 110.201 |
| 0.7652777777777778 | 114.716 |
| 0.7659722222222222 | 110.201 |
| 0.7666666666666666 | 114.716 |
| 0.7673611111111112 | 110.201 |
| 0.7680555555555556 | 110.201 |
| 0.7687499999999999 | 105.69 |
| 0.7694444444444444 | 101.184 |
| 0.7701388888888889 | 101.184 |
| 0.7708333333333334 | 92.184 |
| 0.7715277777777777 | 87.692 |
| 0.7722222222222223 | 78.722 |
| 0.7729166666666667 | 78.722 |
| 0.7736111111111111 | 74.246 |
| 0.7743055555555555 | 78.722 |
| 0.775 | 74.246 |
| 0.7756944444444445 | 83.205 |
| 0.7763888888888889 | 83.205 |
| 0.7770833333333332 | 83.205 |
| 0.7777777777777778 | 83.205 |
| 0.7784722222222222 | 78.722 |
| 0.7791666666666667 | 74.246 |
| 0.779861111111111 | 74.246 |
| 0.7805555555555556 | 69.775 |
| 0.78125 | 69.775 |
| 0.7819444444444444 | 65.31 |
| 0.782638888888889 | 65.31 |
| 0.7833333333333333 | 60.85 |
| 0.7840277777777778 | 56.398 |
| 0.7847222222222222 | 56.398 |
| 0.7854166666666668 | 51.951 |
| 0.7861111111111111 | 51.951 |
| 0.7868055555555555 | 51.951 |
| 0.7875 | 51.951 |
| 0.7881944444444445 | 51.951 |
| 0.7888888888888889 | 47.511 |
| 0.7895833333333333 | 43.079 |
| 0.7902777777777777 | 43.079 |
| 0.7909722222222223 | 38.653 |
| 0.7916666666666666 | 38.653 |
| 0.7923611111111111 | 38.653 |
| 0.7930555555555556 | 34.234 |
| 0.7937500000000001 | 34.234 |
| 0.7944444444444444 | 29.823 |
| 0.7951388888888888 | 29.823 |
| 0.7958333333333334 | 29.823 |
| 0.7965277777777778 | 25.419 |
| 0.7972222222222222 | 25.419 |
| 0.7979166666666666 | 21.024 |
| 0.7986111111111112 | 21.024 |
| 0.7993055555555556 | 21.024 |
| 0.7999999999999999 | 16.636 |
| 0.8006944444444444 | 16.636 |
| 0.8013888888888889 | 16.636 |
| 0.8020833333333334 | 16.636 |
| 0.8027777777777777 | 16.636 |
| 0.8034722222222223 | 12.257 |
| 0.8041666666666667 | 12.257 |
| 0.8048611111111111 | 12.257 |
| 0.8055555555555555 | 12.257 |
| 0.80625 | 12.257 |
| 0.8069444444444445 | 12.257 |
| 0.8076388888888889 | 12.257 |
| 0.8083333333333332 | 12.257 |
| 0.8090277777777778 | 12.257 |
| 0.8097222222222222 | 12.257 |
| 0.8104166666666667 | 12.257 |
| 0.811111111111111 | 12.257 |
| 0.8118055555555556 | 12.257 |
| 0.8125 | 12.257 |
| 0.8131944444444444 | 12.257 |
| 0.813888888888889 | 7.887 |
| 0.8145833333333333 | 7.887 |
| 0.8152777777777778 | 7.887 |
| 0.8159722222222222 | 7.887 |
| 0.8166666666666668 | 7.887 |
| 0.8173611111111111 | 7.887 |
| 0.8180555555555555 | 3.525 |
| 0.81875 | 3.525 |
| 0.8194444444444445 | 3.525 |
| 0.8201388888888889 | 3.525 |
| 0.8208333333333333 | 3.525 |
| 0.8215277777777777 | 3.525 |
| 0.8222222222222223 | 3.525 |
| 0.8229166666666666 | 3.525 |
| 0.8236111111111111 | 3.525 |
| 0.8243055555555556 | 3.525 |
| 0.8250000000000001 | 3.525 |
| 0.8256944444444444 | 3.525 |
| 0.8263888888888888 | 3.525 |
| 0.8270833333333334 | 0 |
| 0.8277777777777778 | 3.525 |
| 0.8284722222222222 | 3.525 |
| 0.8291666666666666 | 0 |
| 0.8298611111111112 | 0 |
| 0.8305555555555556 | 0 |
| 0.8312499999999999 | 0 |
| 0.8319444444444444 | 0 |
| 0.8326388888888889 | 0 |
| 0.8333333333333334 | 0 |
| 0.8340277777777777 | 0 |
| 0.8347222222222223 | 0 |
| 0.8354166666666667 | 0 |
| 0.8361111111111111 | 0 |
| 0.8368055555555555 | 0 |
| 0.8375 | 0 |
| 0.8381944444444445 | 0 |
| 0.8388888888888889 | 0 |
| 0.8395833333333332 | 0 |
| 0.8402777777777778 | 0 |
| 0.8409722222222222 | 0 |
| 0.8416666666666667 | 0 |
| 0.842361111111111 | 0 |
| 0.8430555555555556 | 0 |
| 0.84375 | 0 |
| 0.8444444444444444 | 0 |
| 0.845138888888889 | 0 |
| 0.8458333333333333 | 0 |
| 0.8465277777777778 | 0 |
| 0.8472222222222222 | 0 |
| 0.8479166666666668 | 0 |
| 0.8486111111111111 | 0 |
| 0.8493055555555555 | 0 |
| 0.85 | 0 |
| 0.8506944444444445 | 0 |
| 0.8513888888888889 | 0 |
| 0.8520833333333333 | 0 |
| 0.8527777777777777 | 0 |
| 0.8534722222222223 | 0 |
| 0.8541666666666666 | 0 |
| 0.8548611111111111 | 0 |
| 0.8555555555555556 | 0 |
| 0.8562500000000001 | 0 |
| 0.8569444444444444 | 0 |
| 0.8576388888888888 | 0 |
| 0.8583333333333334 | 0 |
| 0.8590277777777778 | 0 |
| 0.8597222222222222 | 0 |
| 0.8604166666666666 | 0 |
| 0.8611111111111112 | 0 |
| 0.8618055555555556 | 0 |
| 0.8624999999999999 | 0 |
| 0.8631944444444444 | 0 |
| 0.8638888888888889 | 0 |
| 0.8645833333333334 | 0 |
| 0.8652777777777777 | 0 |
| 0.8659722222222223 | 0 |
| 0.8666666666666667 | 0 |
| 0.8673611111111111 | 0 |
| 0.8680555555555555 | 0 |
| 0.86875 | 0 |
| 0.8694444444444445 | 0 |
| 0.8701388888888889 | 0 |
| 0.8708333333333332 | 0 |
| 0.8715277777777778 | 0 |
| 0.8722222222222222 | 0 |
| 0.8729166666666667 | 0 |
| 0.873611111111111 | 0 |
| 0.8743055555555556 | 0 |
| 0.875 | 0 |
| 0.8756944444444444 | 0 |
| 0.876388888888889 | 0 |
| 0.8770833333333333 | 0 |
| 0.8777777777777778 | 0 |
| 0.8784722222222222 | 0 |
| 0.8791666666666668 | 0 |
| 0.8798611111111111 | 0 |
| 0.8805555555555555 | 0 |
| 0.88125 | 0 |
| 0.8819444444444445 | 0 |
| 0.8826388888888889 | 0 |
| 0.8833333333333333 | 0 |
| 0.8840277777777777 | 0 |
| 0.8847222222222223 | 0 |
| 0.8854166666666666 | 0 |
| 0.8861111111111111 | 0 |
| 0.8868055555555556 | 0 |
| 0.8875000000000001 | 0 |
| 0.8881944444444444 | 0 |
| 0.8888888888888888 | 0 |
| 0.8895833333333334 | 0 |
| 0.8902777777777778 | 0 |
| 0.8909722222222222 | 0 |
| 0.8916666666666666 | 0 |
| 0.8923611111111112 | 0 |
| 0.8930555555555556 | 0 |
| 0.8937499999999999 | 0 |
| 0.8944444444444444 | 0 |
| 0.8951388888888889 | 0 |
| 0.8958333333333334 | 0 |
| 0.8965277777777777 | 0 |
| 0.8972222222222223 | 0 |
| 0.8979166666666667 | 0 |
| 0.8986111111111111 | 0 |
| 0.8993055555555555 | 0 |
| 0.9 | 0 |
| 0.9006944444444445 | 0 |
| 0.9013888888888889 | 0 |
| 0.9020833333333332 | 0 |
| 0.9027777777777778 | 0 |
| 0.9034722222222222 | 0 |
| 0.9041666666666667 | 0 |
| 0.904861111111111 | 0 |
| 0.9055555555555556 | 0 |
| 0.90625 | 0 |
| 0.9069444444444444 | 0 |
| 0.907638888888889 | 0 |
| 0.9083333333333333 | 0 |
| 0.9090277777777778 | 0 |
| 0.9097222222222222 | 0 |
| 0.9104166666666668 | 0 |
| 0.9111111111111111 | 0 |
| 0.9118055555555555 | 0 |
| 0.9125 | 0 |
| 0.9131944444444445 | 0 |
| 0.9138888888888889 | 0 |
| 0.9145833333333333 | 0 |
| 0.9152777777777777 | 0 |
| 0.9159722222222223 | 0 |
| 0.9166666666666666 | 0 |
| 0.9173611111111111 | 0 |
| 0.9180555555555556 | 0 |
| 0.9187500000000001 | 0 |
| 0.9194444444444444 | 0 |
| 0.9201388888888888 | 0 |
| 0.9208333333333334 | 0 |
| 0.9215277777777778 | 0 |
| 0.9222222222222222 | 0 |
| 0.9229166666666666 | 0 |
| 0.9236111111111112 | 0 |
| 0.9243055555555556 | 0 |
| 0.9249999999999999 | 0 |
| 0.9256944444444444 | 0 |
| 0.9263888888888889 | 0 |
| 0.9270833333333334 | 0 |
| 0.9277777777777777 | 0 |
| 0.9284722222222223 | 0 |
| 0.9291666666666667 | 0 |
| 0.9298611111111111 | 0 |
| 0.9305555555555555 | 0 |
| 0.93125 | 0 |
| 0.9319444444444445 | 0 |
| 0.9326388888888889 | 0 |
| 0.9333333333333332 | 0 |
| 0.9340277777777778 | 0 |
| 0.9347222222222222 | 0 |
| 0.9354166666666667 | 0 |
| 0.936111111111111 | 0 |
| 0.9368055555555556 | 0 |
| 0.9375 | 0 |
| 0.9381944444444444 | 0 |
| 0.938888888888889 | 0 |
| 0.9395833333333333 | 0 |
| 0.9402777777777778 | 0 |
| 0.9409722222222222 | 0 |
| 0.9416666666666668 | 0 |
| 0.9423611111111111 | 0 |
| 0.9430555555555555 | 0 |
| 0.94375 | 0 |
| 0.9444444444444445 | 0 |
| 0.9451388888888889 | 0 |
| 0.9458333333333333 | 0 |
| 0.9465277777777777 | 0 |
| 0.9472222222222223 | 0 |
| 0.9479166666666666 | 0 |
| 0.9486111111111111 | 0 |
| 0.9493055555555556 | 0 |
| 0.9500000000000001 | 0 |
| 0.9506944444444444 | 0 |
| 0.9513888888888888 | 0 |
| 0.9520833333333334 | 0 |
| 0.9527777777777778 | 0 |
| 0.9534722222222222 | 0 |
| 0.9541666666666666 | 0 |
| 0.9548611111111112 | 0 |
| 0.9555555555555556 | 0 |
| 0.9562499999999999 | 0 |
| 0.9569444444444444 | 0 |
| 0.9576388888888889 | 0 |
| 0.9583333333333334 | 0 |
| 0.9590277777777777 | 0 |
| 0.9597222222222223 | 0 |
| 0.9604166666666667 | 0 |
| 0.9611111111111111 | 0 |
| 0.9618055555555555 | 0 |
| 0.9625 | 0 |
| 0.9631944444444445 | 0 |
| 0.9638888888888889 | 0 |
| 0.9645833333333332 | 0 |
| 0.9652777777777778 | 0 |
| 0.9659722222222222 | 0 |
| 0.9666666666666667 | 0 |
| 0.967361111111111 | 0 |
| 0.9680555555555556 | 0 |
| 0.96875 | 0 |
| 0.9694444444444444 | 0 |
| 0.970138888888889 | 0 |
| 0.9708333333333333 | 0 |
| 0.9715277777777778 | 0 |
| 0.9722222222222222 | 0 |
| 0.9729166666666668 | 0 |
| 0.9736111111111111 | 0 |
| 0.9743055555555555 | 0 |
| 0.975 | 0 |
| 0.9756944444444445 | 0 |
| 0.9763888888888889 | 0 |
| 0.9770833333333333 | 0 |
| 0.9777777777777777 | 0 |
| 0.9784722222222223 | 0 |
| 0.9791666666666666 | 0 |
| 0.9798611111111111 | 0 |
| 0.9805555555555556 | 0 |
| 0.9812500000000001 | 0 |
| 0.9819444444444444 | 0 |
| 0.9826388888888888 | 0 |
| 0.9833333333333334 | 0 |
| 0.9840277777777778 | 0 |
| 0.9847222222222222 | 0 |
| 0.9854166666666666 | 0 |
| 0.9861111111111112 | 0 |
| 0.9868055555555556 | 0 |
| 0.9874999999999999 | 0 |
| 0.9881944444444444 | 0 |
| 0.9888888888888889 | 0 |
| 0.9895833333333334 | 0 |
| 0.9902777777777777 | 0 |
| 0.9909722222222223 | 0 |
| 0.9916666666666667 | 0 |
| 0.9923611111111111 | 0 |
| 0.9930555555555555 | 0 |
| 0.99375 | 0 |
| 0.9944444444444445 | 0 |
| 0.9951388888888889 | 0 |
| 0.9958333333333332 | 0 |
| 0.9965277777777778 | 0 |
| 0.9972222222222222 | 0 |
| 0.9979166666666667 | 0 |
| 0.998611111111111 | 0 |
| 0.9993055555555556 | 0 |